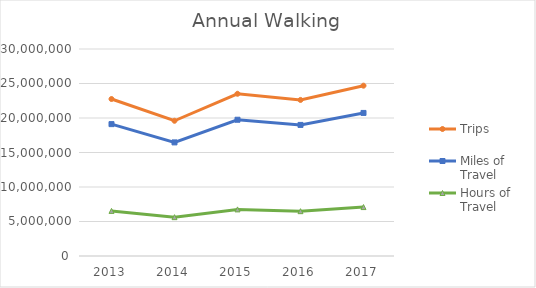
| Category | Trips | Miles of Travel | Hours of Travel |
|---|---|---|---|
| 2013 | 22751925.576 | 19110934.926 | 6535915.324 |
| 2014 | 19599859.262 | 16463293.785 | 5630425.437 |
| 2015 | 23511045.522 | 19748572.907 | 6753986.699 |
| 2016 | 22618059.244 | 18998491.223 | 6497459.722 |
| 2017 | 24685843.788 | 20735368.207 | 7091469.431 |